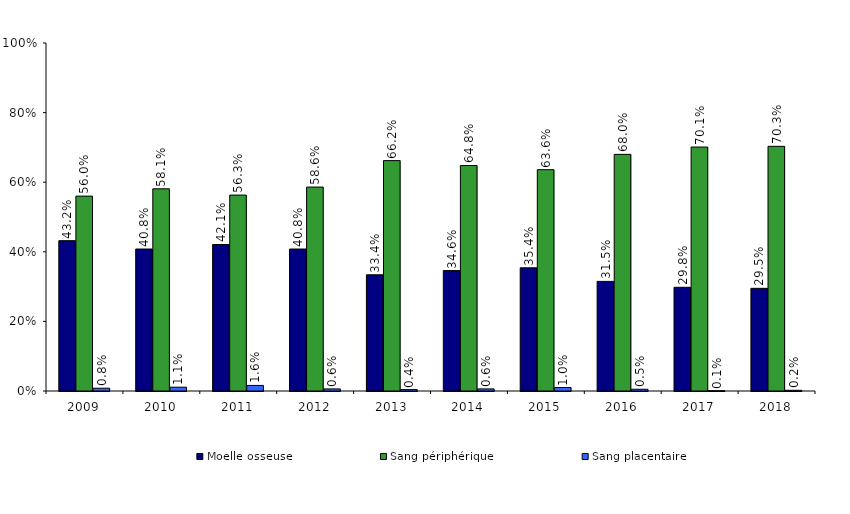
| Category | Moelle osseuse | Sang périphérique | Sang placentaire |
|---|---|---|---|
| 2009.0 | 0.432 | 0.56 | 0.008 |
| 2010.0 | 0.408 | 0.581 | 0.011 |
| 2011.0 | 0.421 | 0.563 | 0.016 |
| 2012.0 | 0.408 | 0.586 | 0.006 |
| 2013.0 | 0.334 | 0.662 | 0.004 |
| 2014.0 | 0.346 | 0.648 | 0.006 |
| 2015.0 | 0.354 | 0.636 | 0.01 |
| 2016.0 | 0.315 | 0.68 | 0.005 |
| 2017.0 | 0.298 | 0.701 | 0.001 |
| 2018.0 | 0.295 | 0.703 | 0.002 |